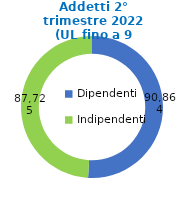
| Category | Series 0 |
|---|---|
| Dipendenti | 90864 |
| Indipendenti | 87725 |